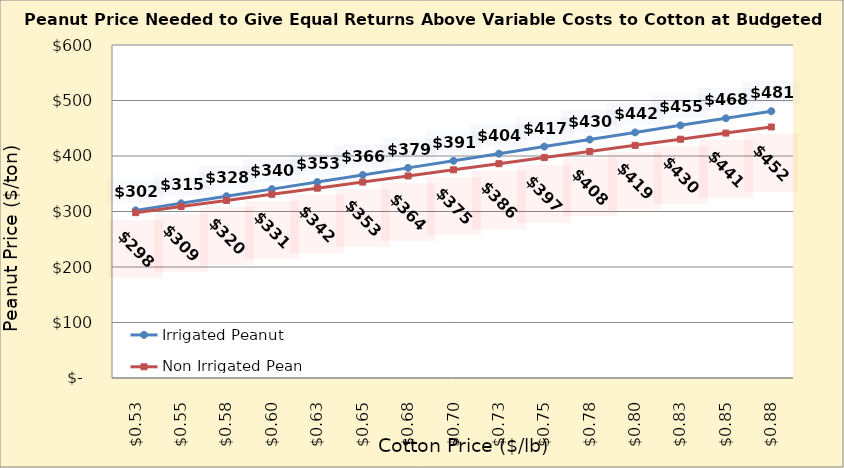
| Category | Irrigated Peanut | Non Irrigated Peanut |
|---|---|---|
| 0.5249999999999998 | 302.031 | 297.891 |
| 0.5499999999999998 | 314.797 | 308.921 |
| 0.5749999999999998 | 327.563 | 319.95 |
| 0.5999999999999999 | 340.329 | 330.98 |
| 0.6249999999999999 | 353.095 | 342.009 |
| 0.6499999999999999 | 365.861 | 353.038 |
| 0.6749999999999999 | 378.627 | 364.068 |
| 0.7 | 391.393 | 375.097 |
| 0.725 | 404.159 | 386.127 |
| 0.75 | 416.925 | 397.156 |
| 0.775 | 429.691 | 408.186 |
| 0.8 | 442.457 | 419.215 |
| 0.8250000000000001 | 455.223 | 430.244 |
| 0.8500000000000001 | 467.989 | 441.274 |
| 0.8750000000000001 | 480.755 | 452.303 |